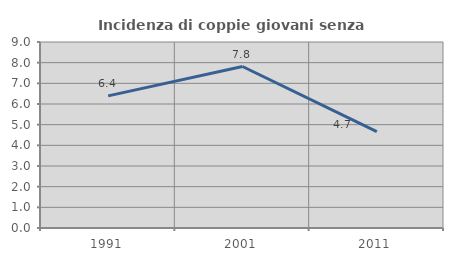
| Category | Incidenza di coppie giovani senza figli |
|---|---|
| 1991.0 | 6.392 |
| 2001.0 | 7.813 |
| 2011.0 | 4.659 |